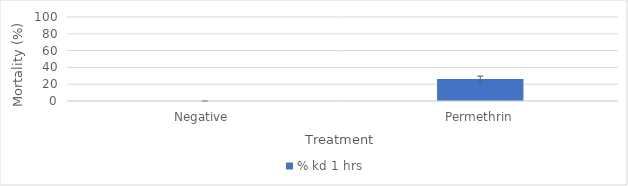
| Category | % kd 1 hrs |
|---|---|
| Negative  | 0 |
| Permethrin | 26.263 |